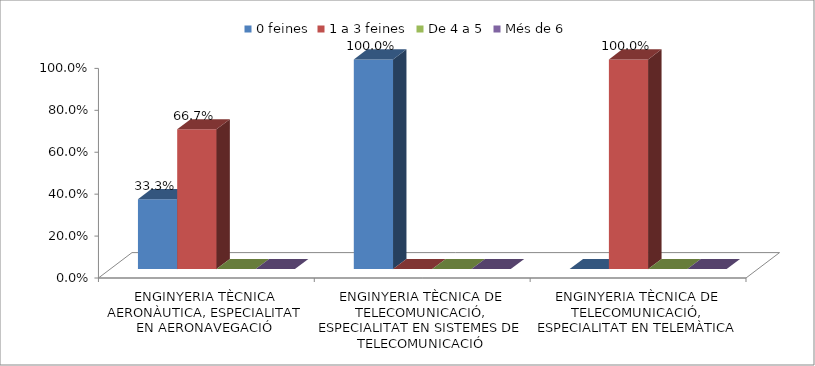
| Category | 0 feines | 1 a 3 feines | De 4 a 5 | Més de 6 |
|---|---|---|---|---|
| ENGINYERIA TÈCNICA AERONÀUTICA, ESPECIALITAT EN AERONAVEGACIÓ | 0.333 | 0.667 | 0 | 0 |
| ENGINYERIA TÈCNICA DE TELECOMUNICACIÓ, ESPECIALITAT EN SISTEMES DE TELECOMUNICACIÓ | 1 | 0 | 0 | 0 |
| ENGINYERIA TÈCNICA DE TELECOMUNICACIÓ, ESPECIALITAT EN TELEMÀTICA | 0 | 1 | 0 | 0 |